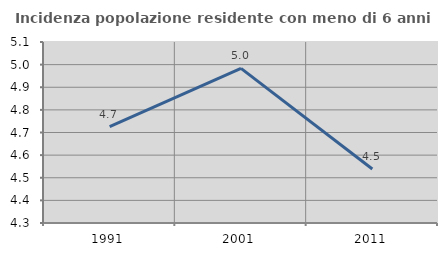
| Category | Incidenza popolazione residente con meno di 6 anni |
|---|---|
| 1991.0 | 4.726 |
| 2001.0 | 4.983 |
| 2011.0 | 4.538 |